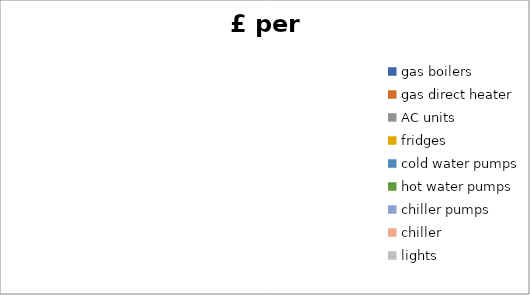
| Category | £ per year |
|---|---|
| gas boilers | 0 |
| gas direct heater | 0 |
| AC units | 0 |
| fridges | 0 |
| cold water pumps | 0 |
| hot water pumps | 0 |
| chiller pumps | 0 |
| chiller | 0 |
| lights | 0 |